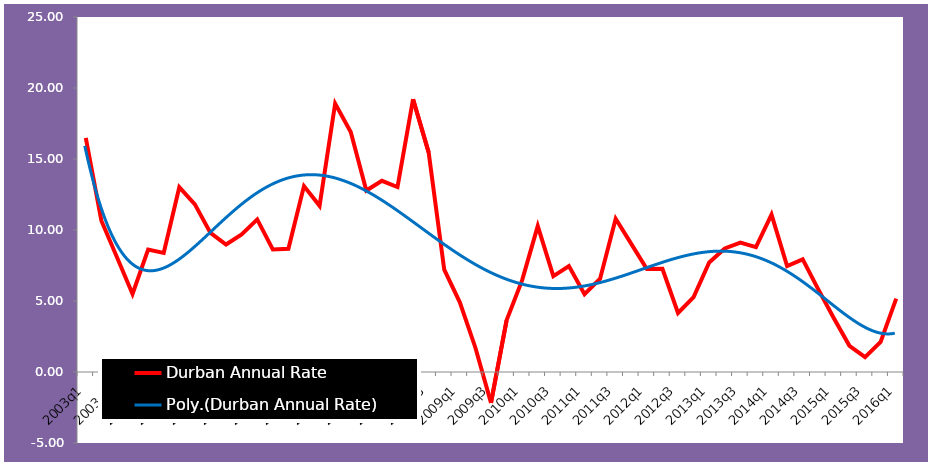
| Category | Durban Annual Rate |
|---|---|
| 2003q1 | 16.484 |
| 2003q2 | 10.653 |
| 2003q3 | 8.077 |
| 2003q4 | 5.498 |
| 2004q1 | 8.622 |
| 2004q2 | 8.384 |
| 2004q3 | 13.013 |
| 2004q4 | 11.807 |
| 2005q1 | 9.8 |
| 2005q2 | 8.977 |
| 2005q3 | 9.688 |
| 2005q4 | 10.745 |
| 2006q1 | 8.628 |
| 2006q2 | 8.672 |
| 2006q3 | 13.091 |
| 2006q4 | 11.701 |
| 2007q1 | 18.906 |
| 2007q2 | 16.896 |
| 2007q3 | 12.778 |
| 2007q4 | 13.461 |
| 2008q1 | 13.024 |
| 2008q2 | 19.21 |
| 2008q3 | 15.464 |
| 2008q4 | 7.204 |
| 2009q1 | 4.911 |
| 2009q2 | 1.709 |
| 2009q3 | -2.176 |
| 2009q4 | 3.641 |
| 2010q1 | 6.468 |
| 2010q2 | 10.276 |
| 2010q3 | 6.755 |
| 2010q4 | 7.464 |
| 2011q1 | 5.482 |
| 2011q2 | 6.575 |
| 2011q3 | 10.788 |
| 2011q4 | 9.024 |
| 2012q1 | 7.251 |
| 2012q2 | 7.268 |
| 2012q3 | 4.154 |
| 2012q4 | 5.271 |
| 2013q1 | 7.716 |
| 2013q2 | 8.7 |
| 2013q3 | 9.118 |
| 2013q4 | 8.798 |
| 2014q1 | 11.087 |
| 2014q2 | 7.456 |
| 2014q3 | 7.927 |
| 2014q4 | 5.817 |
| 2015q1 | 3.785 |
| 2015q2 | 1.845 |
| 2015q3 | 1.047 |
| 2015q4 | 2.122 |
| 2016q1 | 5.165 |